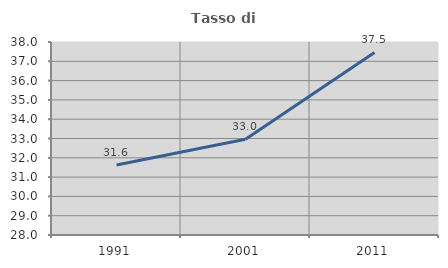
| Category | Tasso di occupazione   |
|---|---|
| 1991.0 | 31.622 |
| 2001.0 | 32.964 |
| 2011.0 | 37.46 |